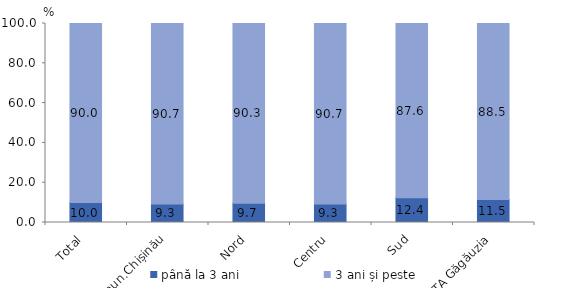
| Category | până la 3 ani | 3 ani și peste |
|---|---|---|
| Total | 10 | 90 |
| mun.Chișinău | 9.3 | 90.7 |
| Nord | 9.7 | 90.3 |
| Centru | 9.3 | 90.7 |
| Sud | 12.4 | 87.6 |
| UTA Găgăuzia | 11.5 | 88.5 |